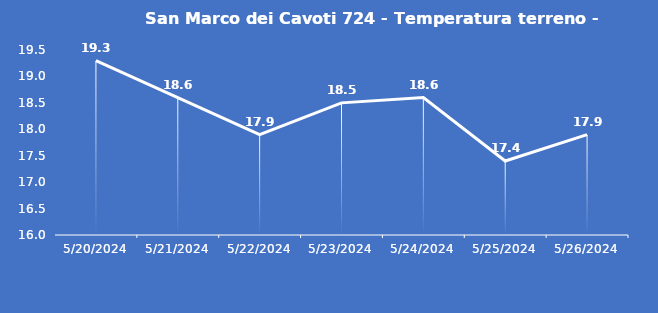
| Category | San Marco dei Cavoti 724 - Temperatura terreno - Grezzo (°C) |
|---|---|
| 5/20/24 | 19.3 |
| 5/21/24 | 18.6 |
| 5/22/24 | 17.9 |
| 5/23/24 | 18.5 |
| 5/24/24 | 18.6 |
| 5/25/24 | 17.4 |
| 5/26/24 | 17.9 |